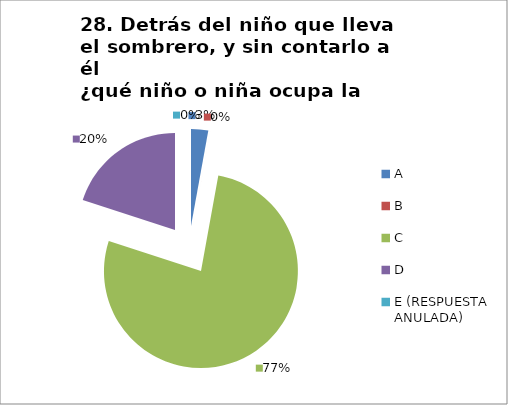
| Category | CANTIDAD DE RESPUESTAS PREGUNTA (28) | PORCENTAJE |
|---|---|---|
| A | 1 | 0.029 |
| B | 0 | 0 |
| C | 27 | 0.771 |
| D | 7 | 0.2 |
| E (RESPUESTA ANULADA) | 0 | 0 |